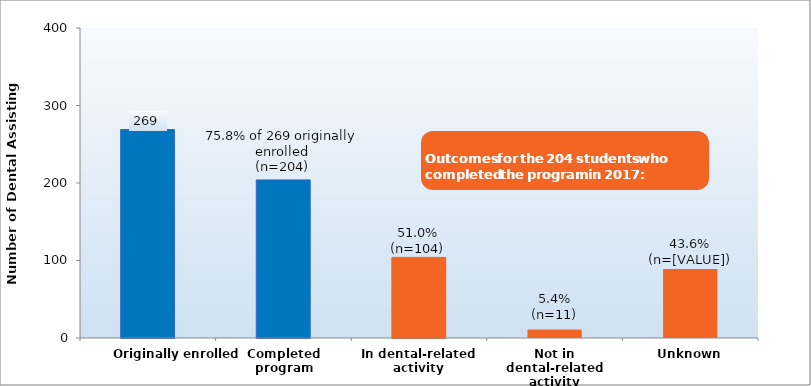
| Category | Series 0 |
|---|---|
| Originally enrolled | 269 |
| Completed program | 204 |
| In dental-related activity | 104 |
| Not in dental-related activity | 11 |
| Unknown | 89 |